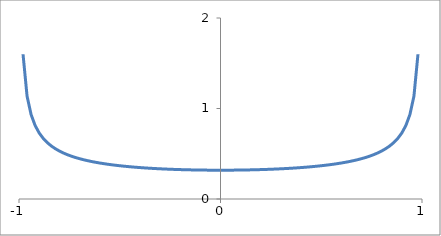
| Category | Series 0 |
|---|---|
| -0.98 | 1.6 |
| -0.96 | 1.137 |
| -0.94 | 0.933 |
| -0.92 | 0.812 |
| -0.9 | 0.73 |
| -0.88 | 0.67 |
| -0.86 | 0.624 |
| -0.84 | 0.587 |
| -0.82 | 0.556 |
| -0.8 | 0.531 |
| -0.78 | 0.509 |
| -0.76 | 0.49 |
| -0.74 | 0.473 |
| -0.72 | 0.459 |
| -0.7 | 0.446 |
| -0.68 | 0.434 |
| -0.66 | 0.424 |
| -0.64 | 0.414 |
| -0.62 | 0.406 |
| -0.6 | 0.398 |
| -0.58 | 0.391 |
| -0.56 | 0.384 |
| -0.54 | 0.378 |
| -0.52 | 0.373 |
| -0.5 | 0.368 |
| -0.48 | 0.363 |
| -0.46 | 0.358 |
| -0.44 | 0.354 |
| -0.419999999999999 | 0.351 |
| -0.399999999999999 | 0.347 |
| -0.379999999999999 | 0.344 |
| -0.359999999999999 | 0.341 |
| -0.339999999999999 | 0.338 |
| -0.319999999999999 | 0.336 |
| -0.299999999999999 | 0.334 |
| -0.279999999999999 | 0.332 |
| -0.259999999999999 | 0.33 |
| -0.239999999999999 | 0.328 |
| -0.219999999999999 | 0.326 |
| -0.199999999999999 | 0.325 |
| -0.179999999999999 | 0.324 |
| -0.159999999999999 | 0.322 |
| -0.139999999999999 | 0.321 |
| -0.119999999999999 | 0.321 |
| -0.099999999999999 | 0.32 |
| -0.079999999999999 | 0.319 |
| -0.0599999999999991 | 0.319 |
| -0.039999999999999 | 0.319 |
| -0.019999999999999 | 0.318 |
| 0.0 | 0.318 |
| 0.02 | 0.318 |
| 0.04 | 0.319 |
| 0.0600000000000001 | 0.319 |
| 0.0800000000000001 | 0.319 |
| 0.1 | 0.32 |
| 0.12 | 0.321 |
| 0.14 | 0.321 |
| 0.16 | 0.322 |
| 0.18 | 0.324 |
| 0.2 | 0.325 |
| 0.22 | 0.326 |
| 0.24 | 0.328 |
| 0.26 | 0.33 |
| 0.28 | 0.332 |
| 0.3 | 0.334 |
| 0.32 | 0.336 |
| 0.34 | 0.338 |
| 0.36 | 0.341 |
| 0.38 | 0.344 |
| 0.4 | 0.347 |
| 0.42 | 0.351 |
| 0.44 | 0.354 |
| 0.46 | 0.358 |
| 0.48 | 0.363 |
| 0.5 | 0.368 |
| 0.52 | 0.373 |
| 0.54 | 0.378 |
| 0.56 | 0.384 |
| 0.58 | 0.391 |
| 0.6 | 0.398 |
| 0.62 | 0.406 |
| 0.64 | 0.414 |
| 0.66 | 0.424 |
| 0.68 | 0.434 |
| 0.7 | 0.446 |
| 0.72 | 0.459 |
| 0.74 | 0.473 |
| 0.76 | 0.49 |
| 0.78 | 0.509 |
| 0.8 | 0.531 |
| 0.82 | 0.556 |
| 0.84 | 0.587 |
| 0.86 | 0.624 |
| 0.88 | 0.67 |
| 0.9 | 0.73 |
| 0.92 | 0.812 |
| 0.94 | 0.933 |
| 0.96 | 1.137 |
| 0.98 | 1.6 |